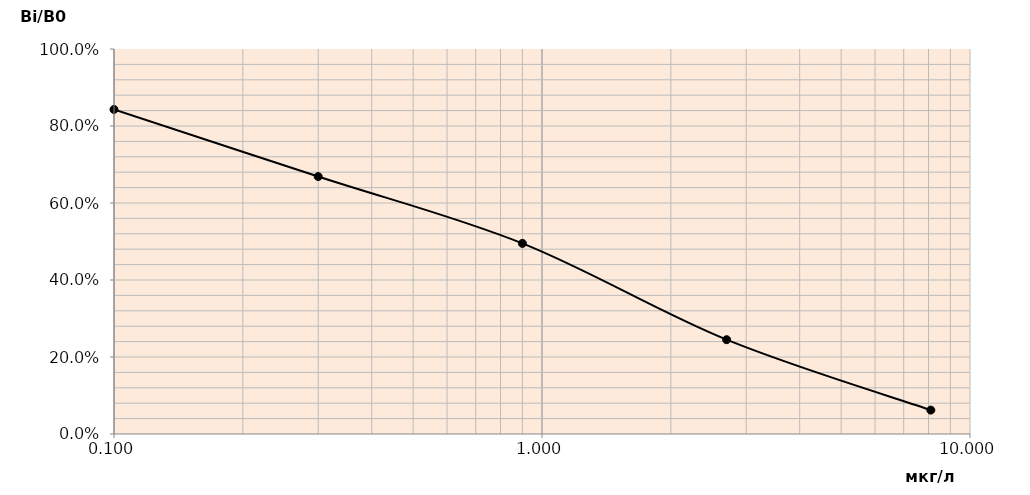
| Category | Series 0 |
|---|---|
| 0.1 | 0.843 |
| 0.3 | 0.669 |
| 0.9 | 0.495 |
| 2.7 | 0.245 |
| 8.1 | 0.062 |